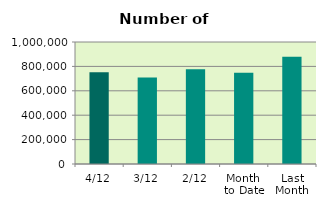
| Category | Series 0 |
|---|---|
| 4/12 | 751702 |
| 3/12 | 709054 |
| 2/12 | 777358 |
| Month 
to Date | 748584 |
| Last
Month | 879957.333 |